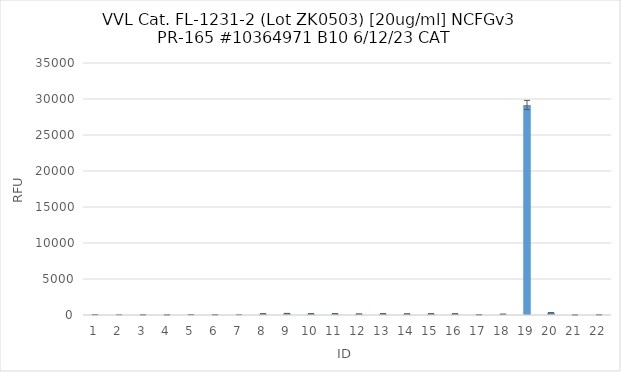
| Category | RFU |
|---|---|
| 0 | 50.5 |
| 1 | 7.25 |
| 2 | 31.25 |
| 3 | 20 |
| 4 | 55.25 |
| 5 | 35.75 |
| 6 | 18.75 |
| 7 | 161.75 |
| 8 | 214.75 |
| 9 | 165.25 |
| 10 | 172.25 |
| 11 | 133.25 |
| 12 | 167.5 |
| 13 | 145.25 |
| 14 | 163.25 |
| 15 | 157 |
| 16 | 37.5 |
| 17 | 105 |
| 18 | 29158 |
| 19 | 305.75 |
| 20 | 6.5 |
| 21 | 31.75 |